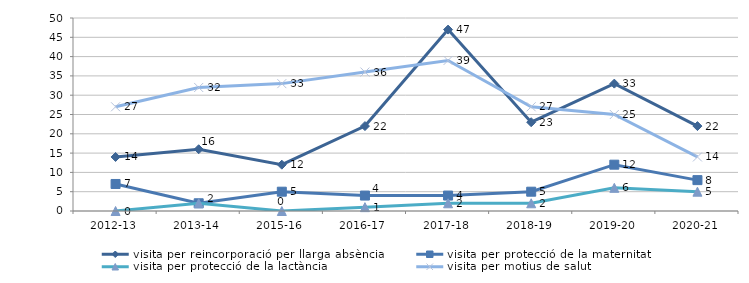
| Category | visita per reincorporació per llarga absència | visita per protecció de la maternitat | visita per protecció de la lactància | visita per motius de salut |
|---|---|---|---|---|
| 2012-13 | 14 | 7 | 0 | 27 |
| 2013-14 | 16 | 2 | 2 | 32 |
| 2015-16 | 12 | 5 | 0 | 33 |
| 2016-17 | 22 | 4 | 1 | 36 |
| 2017-18 | 47 | 4 | 2 | 39 |
| 2018-19 | 23 | 5 | 2 | 27 |
| 2019-20 | 33 | 12 | 6 | 25 |
| 2020-21 | 22 | 8 | 5 | 14 |